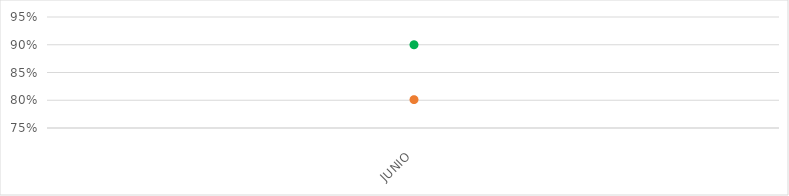
| Category | VALOR  | META PONDERADA |
|---|---|---|
| JUNIO | 0.801 | 0.9 |